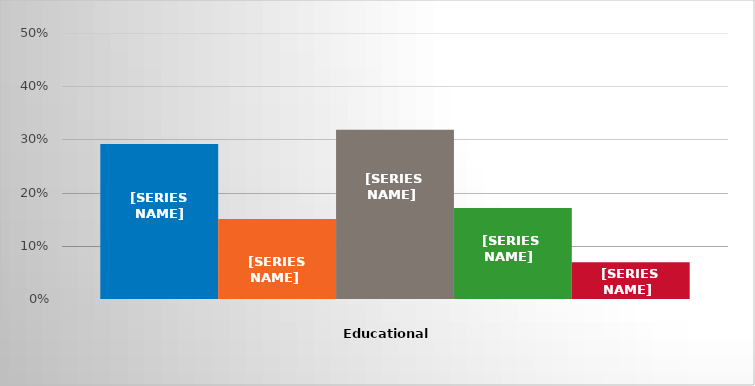
| Category | GED/High school diploma | Less than 1 year of college | 1 year of college | 2 years of college | Other |
|---|---|---|---|---|---|
| 0 | 0.291 | 0.15 | 0.318 | 0.171 | 0.069 |